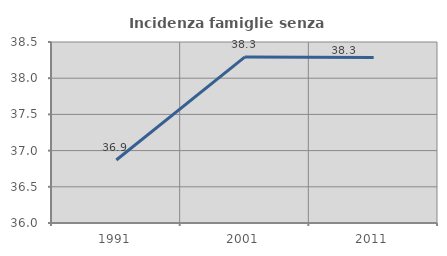
| Category | Incidenza famiglie senza nuclei |
|---|---|
| 1991.0 | 36.87 |
| 2001.0 | 38.294 |
| 2011.0 | 38.286 |